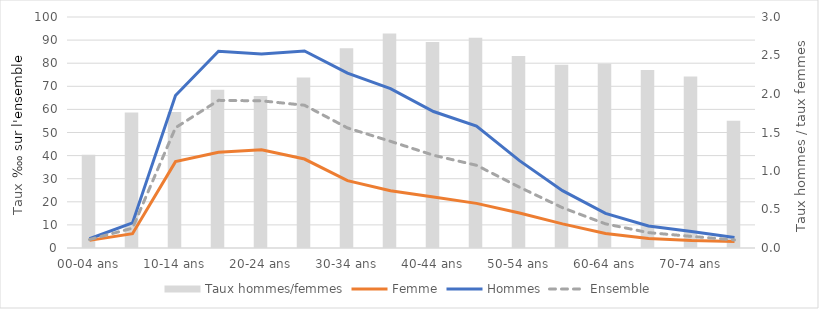
| Category | Taux hommes/femmes |
|---|---|
| 00-04 ans | 1.211 |
| 05-09 ans | 1.759 |
| 10-14 ans | 1.765 |
| 15-19 ans | 2.057 |
| 20-24 ans | 1.973 |
| 25-29 ans | 2.215 |
| 30-34 ans | 2.596 |
| 35-39 ans | 2.784 |
| 40-44 ans | 2.674 |
| 45-49 ans | 2.731 |
| 50-54 ans | 2.492 |
| 55-59 ans | 2.381 |
| 60-64 ans | 2.393 |
| 65-69 ans | 2.312 |
| 70-74 ans | 2.227 |
| 75 ans et plus | 1.654 |